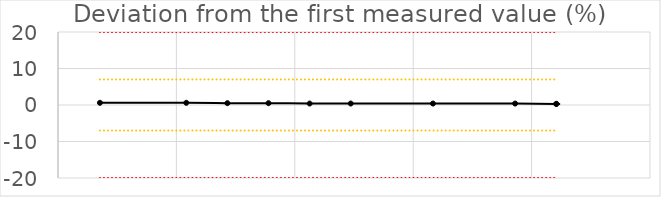
| Category | Abweichung 1. Messung |
|---|---|
| 43594.37708333333 | 0.6 |
| 43594.39166666667 | 0.6 |
| 43594.39861111111 | 0.5 |
| 43594.40555555555 | 0.5 |
| 43594.4125 | 0.4 |
| 43594.419444444444 | 0.4 |
| 43594.433333333334 | 0.4 |
| 43594.447222222225 | 0.4 |
| 43594.45416666667 | 0.3 |
| 43594.45416666667 | 0.3 |
| nan | 0 |
| nan | 0 |
| nan | 0 |
| nan | 0 |
| nan | 0 |
| nan | 0 |
| nan | 0 |
| nan | 0 |
| nan | 0 |
| nan | 0 |
| nan | 0 |
| nan | 0 |
| nan | 0 |
| nan | 0 |
| nan | 0 |
| nan | 0 |
| nan | 0 |
| nan | 0 |
| nan | 0 |
| nan | 0 |
| nan | 0 |
| nan | 0 |
| nan | 0 |
| nan | 0 |
| nan | 0 |
| nan | 0 |
| nan | 0 |
| nan | 0 |
| nan | 0 |
| nan | 0 |
| nan | 0 |
| nan | 0 |
| nan | 0 |
| nan | 0 |
| nan | 0 |
| nan | 0 |
| nan | 0 |
| nan | 0 |
| nan | 0 |
| nan | 0 |
| nan | 0 |
| nan | 0 |
| nan | 0 |
| nan | 0 |
| nan | 0 |
| nan | 0 |
| nan | 0 |
| nan | 0 |
| nan | 0 |
| nan | 0 |
| nan | 0 |
| nan | 0 |
| nan | 0 |
| nan | 0 |
| nan | 0 |
| nan | 0 |
| nan | 0 |
| nan | 0 |
| nan | 0 |
| nan | 0 |
| nan | 0 |
| nan | 0 |
| nan | 0 |
| nan | 0 |
| nan | 0 |
| nan | 0 |
| nan | 0 |
| nan | 0 |
| nan | 0 |
| nan | 0 |
| nan | 0 |
| nan | 0 |
| nan | 0 |
| nan | 0 |
| nan | 0 |
| nan | 0 |
| nan | 0 |
| nan | 0 |
| nan | 0 |
| nan | 0 |
| nan | 0 |
| nan | 0 |
| nan | 0 |
| nan | 0 |
| nan | 0 |
| nan | 0 |
| nan | 0 |
| nan | 0 |
| nan | 0 |
| nan | 0 |